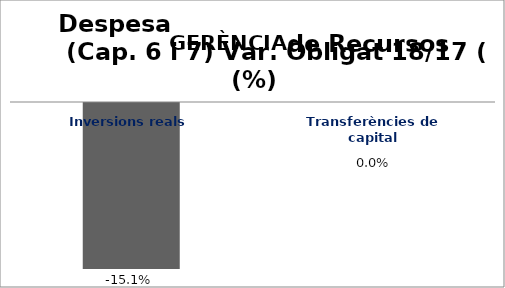
| Category | Series 0 |
|---|---|
| Inversions reals | -0.151 |
| Transferències de capital | 0 |